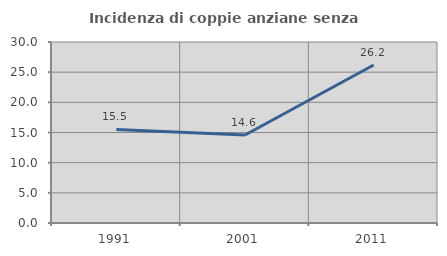
| Category | Incidenza di coppie anziane senza figli  |
|---|---|
| 1991.0 | 15.517 |
| 2001.0 | 14.583 |
| 2011.0 | 26.19 |